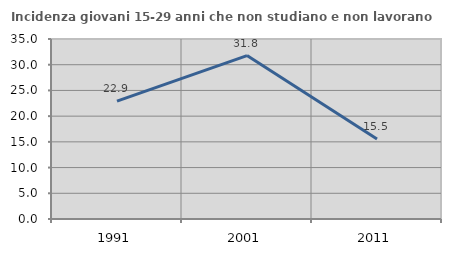
| Category | Incidenza giovani 15-29 anni che non studiano e non lavorano  |
|---|---|
| 1991.0 | 22.931 |
| 2001.0 | 31.783 |
| 2011.0 | 15.549 |